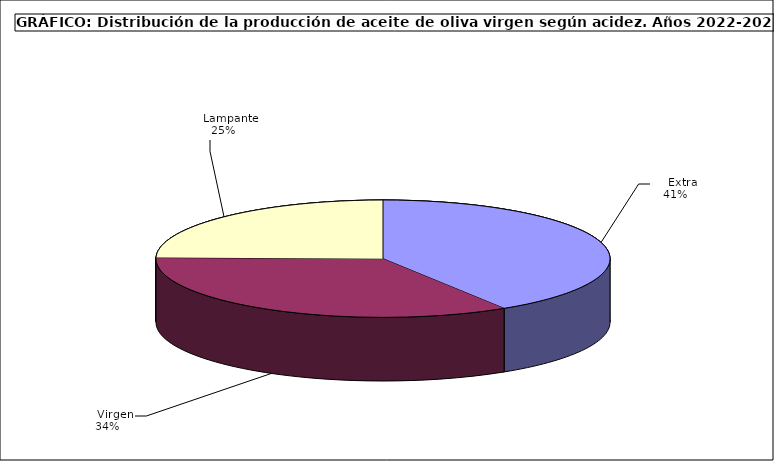
| Category | Series 0 |
|---|---|
|     Extra  | 275886 |
|     Virgen  | 230252 |
|     Lampante  | 165965 |